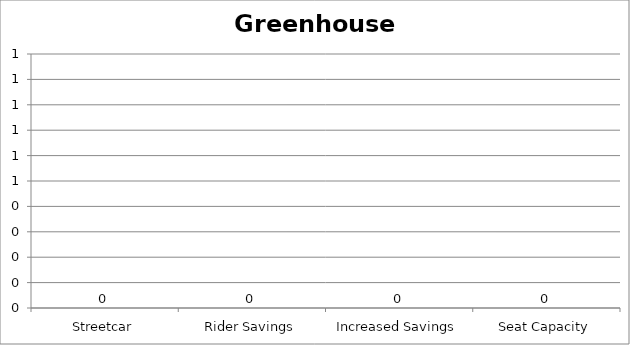
| Category | Greenhouse Gas |
|---|---|
| Streetcar | 0 |
| Rider Savings | 0 |
| Increased Savings | 0 |
| Seat Capacity | 0 |